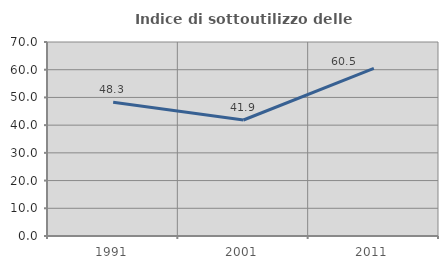
| Category | Indice di sottoutilizzo delle abitazioni  |
|---|---|
| 1991.0 | 48.276 |
| 2001.0 | 41.86 |
| 2011.0 | 60.465 |